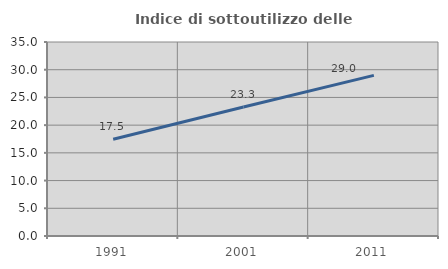
| Category | Indice di sottoutilizzo delle abitazioni  |
|---|---|
| 1991.0 | 17.465 |
| 2001.0 | 23.266 |
| 2011.0 | 28.986 |